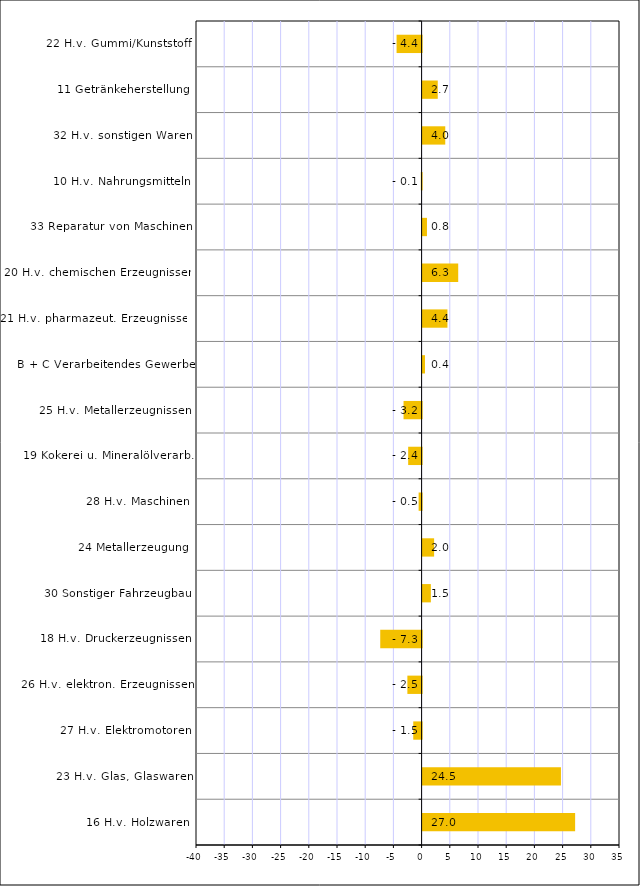
| Category | Series 0 |
|---|---|
| 16 H.v. Holzwaren | 27.044 |
| 23 H.v. Glas, Glaswaren | 24.528 |
| 27 H.v. Elektromotoren | -1.481 |
| 26 H.v. elektron. Erzeugnissen | -2.522 |
| 18 H.v. Druckerzeugnissen | -7.333 |
| 30 Sonstiger Fahrzeugbau | 1.463 |
| 24 Metallerzeugung | 2.041 |
| 28 H.v. Maschinen | -0.527 |
| 19 Kokerei u. Mineralölverarb. | -2.382 |
| 25 H.v. Metallerzeugnissen | -3.201 |
| B + C Verarbeitendes Gewerbe | 0.425 |
| 21 H.v. pharmazeut. Erzeugnissen | 4.405 |
| 20 H.v. chemischen Erzeugnissen | 6.314 |
| 33 Reparatur von Maschinen | 0.775 |
| 10 H.v. Nahrungsmitteln | -0.139 |
| 32 H.v. sonstigen Waren | 4.017 |
| 11 Getränkeherstellung | 2.687 |
| 22 H.v. Gummi/Kunststoff | -4.438 |